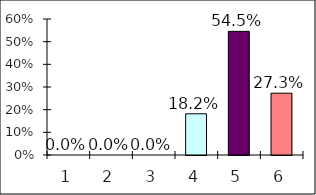
| Category | Series 0 |
|---|---|
| 0 | 0 |
| 1 | 0 |
| 2 | 0 |
| 3 | 0.182 |
| 4 | 0.545 |
| 5 | 0.273 |